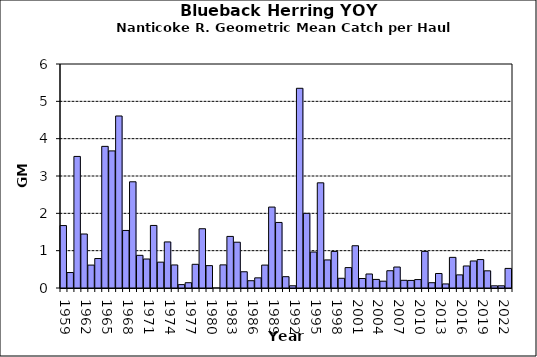
| Category | Series 0 |
|---|---|
| 1959.0 | 1.672 |
| 1960.0 | 0.414 |
| 1961.0 | 3.524 |
| 1962.0 | 1.446 |
| 1963.0 | 0.614 |
| 1964.0 | 0.789 |
| 1965.0 | 3.794 |
| 1966.0 | 3.672 |
| 1967.0 | 4.607 |
| 1968.0 | 1.542 |
| 1969.0 | 2.845 |
| 1970.0 | 0.875 |
| 1971.0 | 0.777 |
| 1972.0 | 1.676 |
| 1973.0 | 0.692 |
| 1974.0 | 1.234 |
| 1975.0 | 0.617 |
| 1976.0 | 0.091 |
| 1977.0 | 0.142 |
| 1978.0 | 0.635 |
| 1979.0 | 1.587 |
| 1980.0 | 0.599 |
| 1981.0 | 0 |
| 1982.0 | 0.619 |
| 1983.0 | 1.382 |
| 1984.0 | 1.227 |
| 1985.0 | 0.435 |
| 1986.0 | 0.195 |
| 1987.0 | 0.272 |
| 1988.0 | 0.614 |
| 1989.0 | 2.168 |
| 1990.0 | 1.756 |
| 1991.0 | 0.303 |
| 1992.0 | 0.059 |
| 1993.0 | 5.35 |
| 1994.0 | 2 |
| 1995.0 | 0.963 |
| 1996.0 | 2.818 |
| 1997.0 | 0.752 |
| 1998.0 | 0.98 |
| 1999.0 | 0.26 |
| 2000.0 | 0.546 |
| 2001.0 | 1.132 |
| 2002.0 | 0.254 |
| 2003.0 | 0.375 |
| 2004.0 | 0.23 |
| 2005.0 | 0.183 |
| 2006.0 | 0.463 |
| 2007.0 | 0.562 |
| 2008.0 | 0.206 |
| 2009.0 | 0.203 |
| 2010.0 | 0.226 |
| 2011.0 | 0.981 |
| 2012.0 | 0.142 |
| 2013.0 | 0.389 |
| 2014.0 | 0.109 |
| 2015.0 | 0.82 |
| 2016.0 | 0.352 |
| 2017.0 | 0.59 |
| 2018.0 | 0.724 |
| 2019.0 | 0.762 |
| 2020.0 | 0.46 |
| 2021.0 | 0.059 |
| 2022.0 | 0.059 |
| 2023.0 | 0.525 |